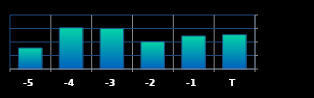
| Category | Series 0 |
|---|---|
| T | 508397 |
| -1 | 489974 |
| -2 | 404166 |
| -3 | 601904 |
| -4 | 611214 |
| -5 | 311727 |